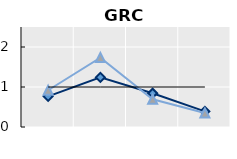
| Category | Né à l'étranger | Né dans le pays | Series 1 |
|---|---|---|---|
| 15-24 | 0.767 | 0.919 | 1 |
| 25-54 | 1.24 | 1.735 | 1 |
| 55-64 | 0.845 | 0.692 | 1 |
| 65+ | 0.391 | 0.349 | 1 |